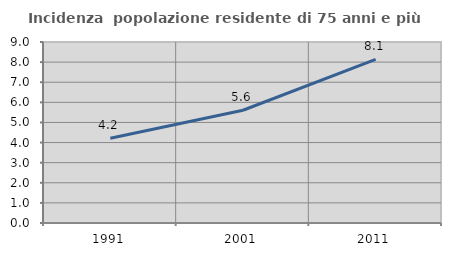
| Category | Incidenza  popolazione residente di 75 anni e più |
|---|---|
| 1991.0 | 4.218 |
| 2001.0 | 5.607 |
| 2011.0 | 8.137 |